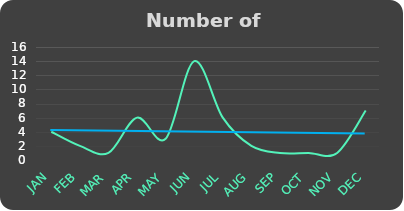
| Category | Series 0 |
|---|---|
| JAN | 4 |
| FEB | 2 |
| MAR | 1 |
| APR | 6 |
| MAY | 3 |
| JUN | 14 |
| JUL | 6 |
| AUG | 2 |
| SEP | 1 |
| OCT | 1 |
| NOV | 1 |
| DEC | 7 |